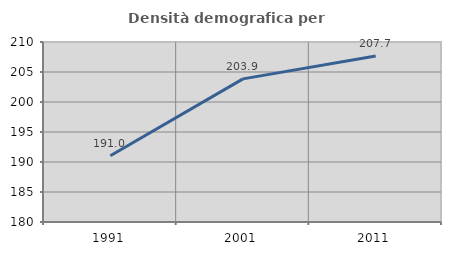
| Category | Densità demografica |
|---|---|
| 1991.0 | 191.047 |
| 2001.0 | 203.854 |
| 2011.0 | 207.681 |